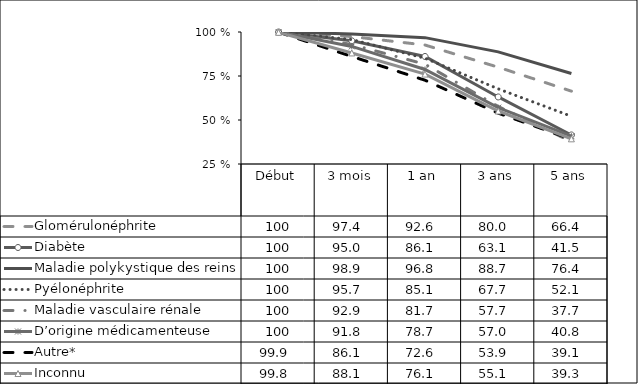
| Category | Glomérulonéphrite | Diabète | Maladie polykystique des reins | Pyélonéphrite | Maladie vasculaire rénale | D’origine médicamenteuse | Autre* | Inconnu |
|---|---|---|---|---|---|---|---|---|
| Début | 100 | 100 | 100 | 100 | 100 | 100 | 99.9 | 99.8 |
| 3 mois | 97.4 | 95 | 98.9 | 95.7 | 92.9 | 91.8 | 86.1 | 88.1 |
| 1 an | 92.6 | 86.1 | 96.8 | 85.1 | 81.7 | 78.7 | 72.6 | 76.1 |
| 3 ans | 80 | 63.1 | 88.7 | 67.7 | 57.7 | 57 | 53.9 | 55.1 |
| 5 ans | 66.4 | 41.5 | 76.4 | 52.1 | 37.7 | 40.8 | 39.1 | 39.3 |